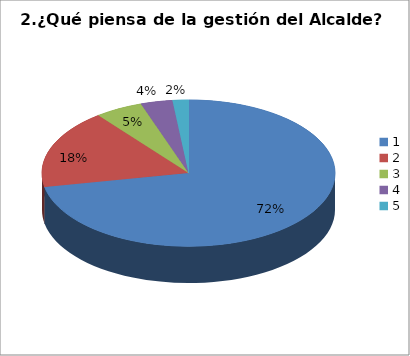
| Category | Series 0 |
|---|---|
| 0 | 41 |
| 1 | 10 |
| 2 | 3 |
| 3 | 2 |
| 4 | 1 |